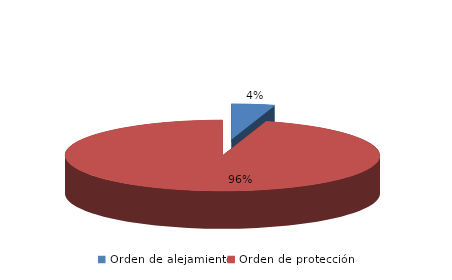
| Category | Series 0 |
|---|---|
| Orden de alejamiento | 5 |
| Orden de protección | 108 |